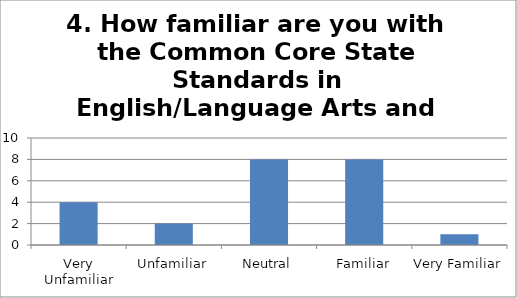
| Category | 4. How familiar are you with the Common Core State Standards in English/Language Arts and Mathematics? Responses |
|---|---|
| Very Unfamiliar | 4 |
| Unfamiliar | 2 |
| Neutral | 8 |
| Familiar | 8 |
| Very Familiar | 1 |